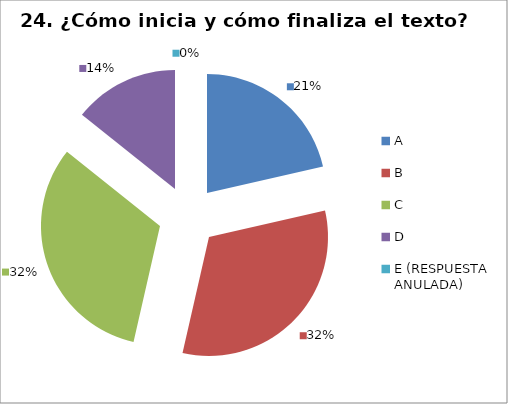
| Category | CANTIDAD DE RESPUESTAS PREGUNTA (23) | PORCENTAJE |
|---|---|---|
| A | 6 | 0.214 |
| B | 9 | 0.321 |
| C | 9 | 0.321 |
| D | 4 | 0.143 |
| E (RESPUESTA ANULADA) | 0 | 0 |